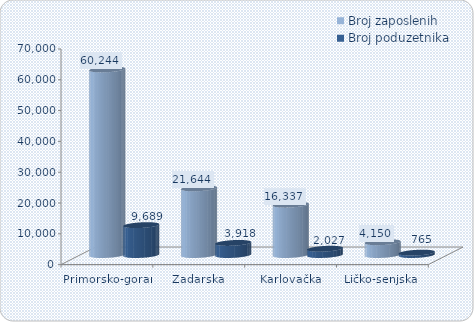
| Category | Broj zaposlenih | Broj poduzetnika |
|---|---|---|
| Primorsko-goranska | 60244 | 9689 |
| Zadarska | 21644 | 3918 |
| Karlovačka | 16337 | 2027 |
| Ličko-senjska | 4150 | 765 |